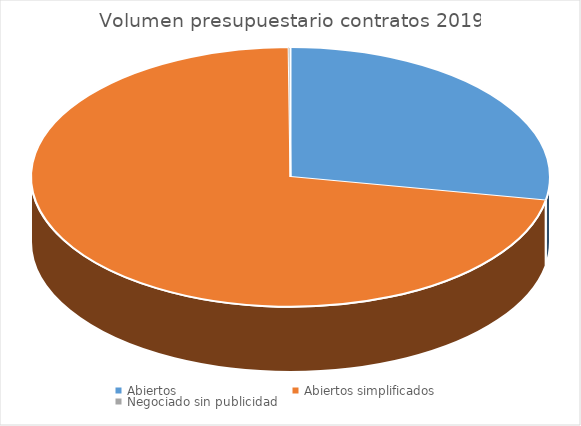
| Category | Series 0 | Series 1 |
|---|---|---|
| Abiertos | 1930738.53 |  |
| Abiertos simplificados | 4977912.46 |  |
| Negociado sin publicidad | 7920 |  |